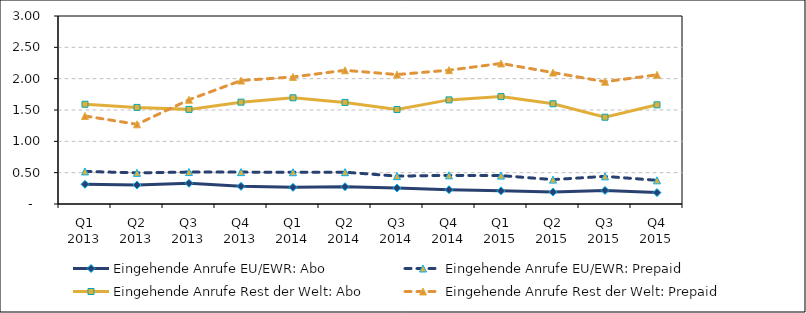
| Category | Eingehende Anrufe EU/EWR: Abo | Eingehende Anrufe EU/EWR: Prepaid | Eingehende Anrufe Rest der Welt: Abo | Eingehende Anrufe Rest der Welt: Prepaid |
|---|---|---|---|---|
| Q1 2013 | 0.315 | 0.52 | 1.592 | 1.404 |
| Q2 2013 | 0.302 | 0.497 | 1.541 | 1.272 |
| Q3 2013 | 0.331 | 0.51 | 1.51 | 1.664 |
| Q4 2013 | 0.283 | 0.509 | 1.625 | 1.97 |
| Q1 2014 | 0.266 | 0.507 | 1.695 | 2.027 |
| Q2 2014 | 0.275 | 0.508 | 1.621 | 2.133 |
| Q3 2014 | 0.254 | 0.445 | 1.507 | 2.066 |
| Q4 2014 | 0.228 | 0.457 | 1.661 | 2.136 |
| Q1 2015 | 0.211 | 0.453 | 1.714 | 2.243 |
| Q2 2015 | 0.19 | 0.389 | 1.6 | 2.097 |
| Q3 2015 | 0.217 | 0.441 | 1.385 | 1.951 |
| Q4 2015 | 0.182 | 0.378 | 1.582 | 2.062 |